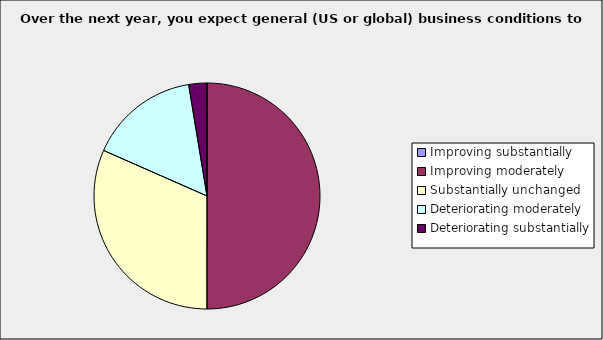
| Category | Series 0 |
|---|---|
| Improving substantially | 0 |
| Improving moderately | 0.5 |
| Substantially unchanged | 0.316 |
| Deteriorating moderately | 0.158 |
| Deteriorating substantially | 0.026 |